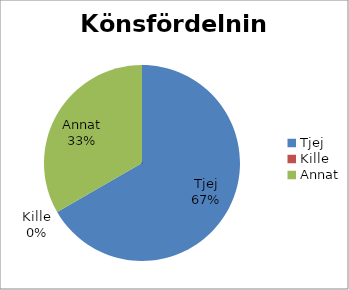
| Category | Series 0 |
|---|---|
| Tjej | 2 |
| Kille | 0 |
| Annat | 1 |